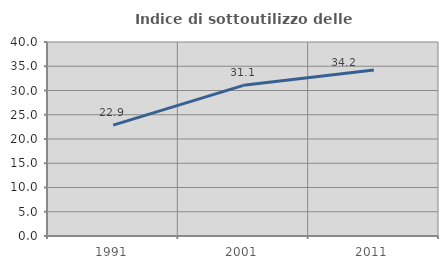
| Category | Indice di sottoutilizzo delle abitazioni  |
|---|---|
| 1991.0 | 22.863 |
| 2001.0 | 31.064 |
| 2011.0 | 34.236 |